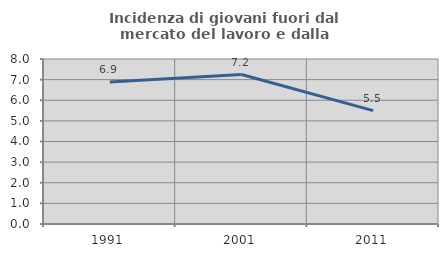
| Category | Incidenza di giovani fuori dal mercato del lavoro e dalla formazione  |
|---|---|
| 1991.0 | 6.888 |
| 2001.0 | 7.246 |
| 2011.0 | 5.497 |